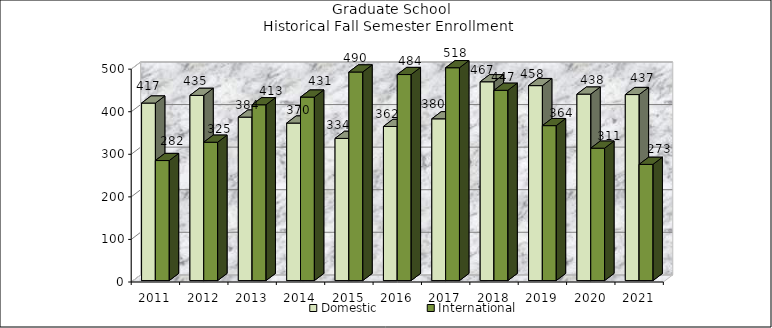
| Category | Domestic | International |
|---|---|---|
| 2011.0 | 417 | 282 |
| 2012.0 | 435 | 325 |
| 2013.0 | 384 | 413 |
| 2014.0 | 370 | 431 |
| 2015.0 | 334 | 490 |
| 2016.0 | 362 | 484 |
| 2017.0 | 380 | 518 |
| 2018.0 | 467 | 447 |
| 2019.0 | 458 | 364 |
| 2020.0 | 438 | 311 |
| 2021.0 | 437 | 273 |